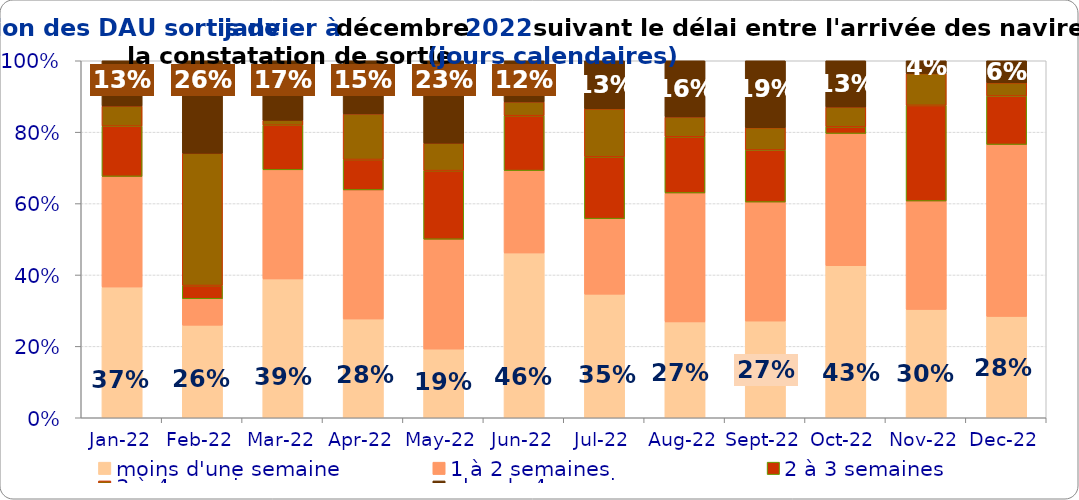
| Category | moins d'une semaine | 1 à 2 semaines | 2 à 3 semaines | 3 à 4 semaines | plus de 4 semaines |
|---|---|---|---|---|---|
| 2022-01-01 | 0.366 | 0.31 | 0.141 | 0.056 | 0.127 |
| 2022-02-01 | 0.259 | 0.074 | 0.037 | 0.37 | 0.259 |
| 2022-03-01 | 0.389 | 0.306 | 0.125 | 0.014 | 0.167 |
| 2022-04-01 | 0.277 | 0.362 | 0.085 | 0.128 | 0.149 |
| 2022-05-01 | 0.192 | 0.308 | 0.192 | 0.077 | 0.231 |
| 2022-06-01 | 0.462 | 0.231 | 0.154 | 0.038 | 0.115 |
| 2022-07-01 | 0.346 | 0.212 | 0.173 | 0.135 | 0.135 |
| 2022-08-01 | 0.269 | 0.361 | 0.157 | 0.056 | 0.157 |
| 2022-09-01 | 0.271 | 0.333 | 0.146 | 0.062 | 0.188 |
| 2022-10-01 | 0.426 | 0.37 | 0.019 | 0.056 | 0.13 |
| 2022-11-01 | 0.304 | 0.304 | 0.268 | 0.089 | 0.036 |
| 2022-12-01 | 0.284 | 0.481 | 0.136 | 0.037 | 0.062 |